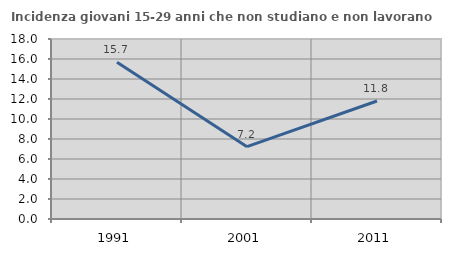
| Category | Incidenza giovani 15-29 anni che non studiano e non lavorano  |
|---|---|
| 1991.0 | 15.668 |
| 2001.0 | 7.233 |
| 2011.0 | 11.803 |